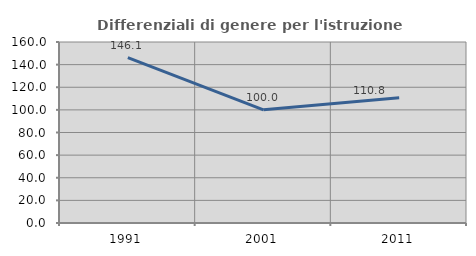
| Category | Differenziali di genere per l'istruzione superiore |
|---|---|
| 1991.0 | 146.114 |
| 2001.0 | 100.028 |
| 2011.0 | 110.779 |